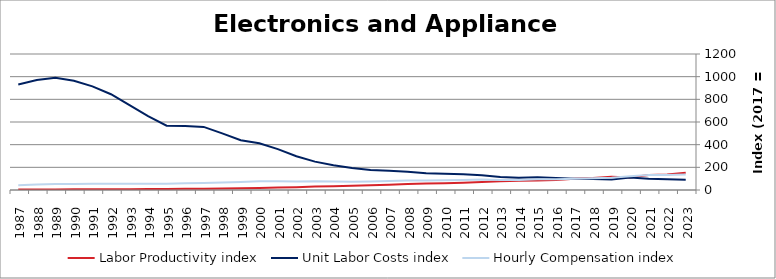
| Category | Labor Productivity index | Unit Labor Costs index | Hourly Compensation index |
|---|---|---|---|
| 2023.0 | 151.371 | 90.461 | 136.933 |
| 2022.0 | 137.316 | 95.615 | 131.294 |
| 2021.0 | 132.784 | 100.013 | 132.802 |
| 2020.0 | 110.919 | 110.094 | 122.114 |
| 2019.0 | 115.893 | 93.301 | 108.129 |
| 2018.0 | 106.061 | 97.068 | 102.951 |
| 2017.0 | 100 | 100 | 100 |
| 2016.0 | 88.871 | 106.126 | 94.315 |
| 2015.0 | 84.726 | 112.35 | 95.19 |
| 2014.0 | 81.911 | 108.498 | 88.872 |
| 2013.0 | 77.902 | 113.692 | 88.568 |
| 2012.0 | 70.952 | 130.012 | 92.246 |
| 2011.0 | 64.217 | 138.061 | 88.658 |
| 2010.0 | 59.905 | 142.504 | 85.367 |
| 2009.0 | 56.956 | 146.936 | 83.69 |
| 2008.0 | 51.963 | 161.15 | 83.739 |
| 2007.0 | 46.441 | 170.027 | 78.963 |
| 2006.0 | 42.281 | 177.037 | 74.853 |
| 2005.0 | 38.075 | 193.292 | 73.596 |
| 2004.0 | 34.173 | 217.636 | 74.373 |
| 2003.0 | 30.508 | 250.269 | 76.353 |
| 2002.0 | 25.065 | 297.537 | 74.578 |
| 2001.0 | 21.163 | 360.874 | 76.372 |
| 2000.0 | 18.682 | 411.781 | 76.928 |
| 1999.0 | 16.256 | 439.615 | 71.465 |
| 1998.0 | 13.349 | 499.772 | 66.714 |
| 1997.0 | 11.192 | 556.619 | 62.296 |
| 1996.0 | 10.403 | 564.686 | 58.743 |
| 1995.0 | 9.78 | 567.559 | 55.51 |
| 1994.0 | 8.585 | 651.377 | 55.92 |
| 1993.0 | 7.38 | 749.465 | 55.312 |
| 1992.0 | 6.559 | 844.823 | 55.415 |
| 1991.0 | 5.943 | 914.161 | 54.328 |
| 1990.0 | 5.587 | 963.766 | 53.848 |
| 1989.0 | 5.272 | 989.426 | 52.159 |
| 1988.0 | 5.03 | 971.349 | 48.858 |
| 1987.0 | 4.47 | 931.504 | 41.64 |